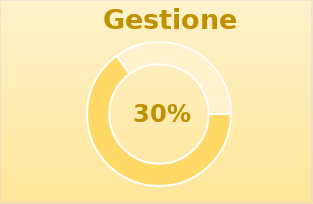
| Category | Series 0 |
|---|---|
| 0 | 1.3 |
| 1 | 0.7 |